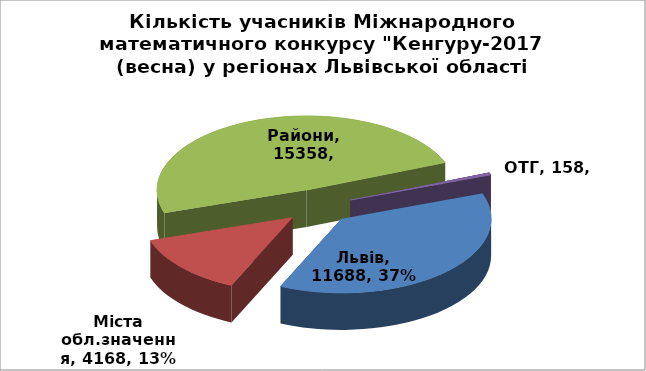
| Category | Р |
|---|---|
| Львів | 11688 |
| Міста обл.значення | 4168 |
| Райони | 15358 |
| ОТГ | 158 |